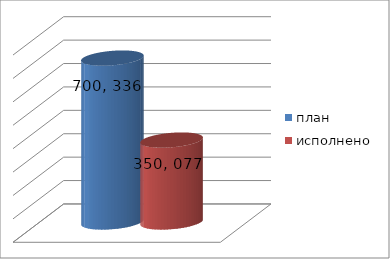
| Category | план | исполнено |
|---|---|---|
| 0 | 700336471.63 | 350077711.33 |